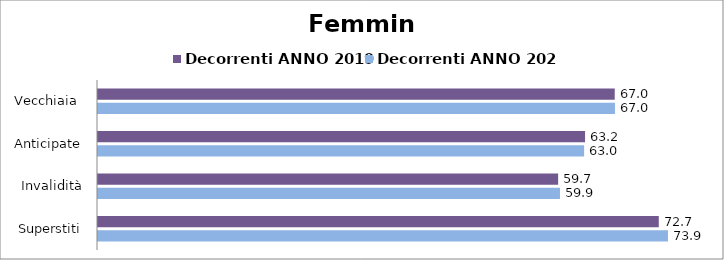
| Category | Decorrenti ANNO 2019 | Decorrenti ANNO 2020 |
|---|---|---|
| Vecchiaia  | 67 | 67.03 |
|  Anticipate | 63.15 | 63.03 |
| Invalidità | 59.66 | 59.9 |
| Superstiti | 72.71 | 73.9 |